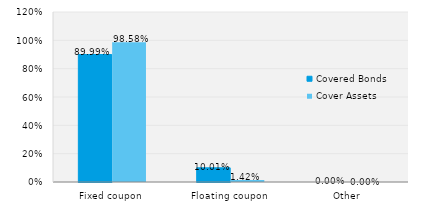
| Category | Covered Bonds | Cover Assets |
|---|---|---|
| Fixed coupon | 0.9 | 0.986 |
| Floating coupon | 0.1 | 0.014 |
| Other | 0 | 0 |